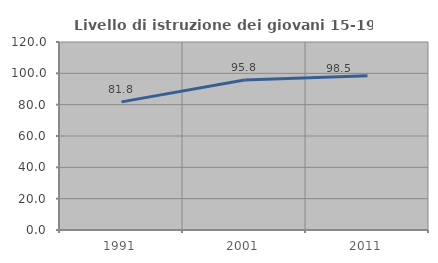
| Category | Livello di istruzione dei giovani 15-19 anni |
|---|---|
| 1991.0 | 81.776 |
| 2001.0 | 95.802 |
| 2011.0 | 98.499 |